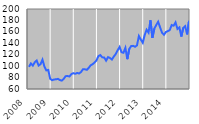
| Category | Series 0 |
|---|---|
| 2008.0 | 98.771 |
| 2.0 | 104.681 |
| 3.0 | 100.936 |
| 4.0 | 106.721 |
| 5.0 | 109.864 |
| 6.0 | 101.053 |
| 7.0 | 103.411 |
| 8.0 | 111.343 |
| 9.0 | 99.469 |
| 10.0 | 92.603 |
| 11.0 | 93.321 |
| 12.0 | 77.827 |
| 2009.0 | 75.386 |
| 2.0 | 76.71 |
| 3.0 | 76.933 |
| 4.0 | 77.768 |
| 5.0 | 75.758 |
| 6.0 | 74.684 |
| 7.0 | 77.626 |
| 8.0 | 82.444 |
| 9.0 | 82.711 |
| 10.0 | 81.892 |
| 11.0 | 86.129 |
| 12.0 | 87.727 |
| 2010.0 | 86.584 |
| 2.0 | 88.111 |
| 3.0 | 87.177 |
| 4.0 | 89.75 |
| 5.0 | 94.631 |
| 6.0 | 94.399 |
| 7.0 | 93.563 |
| 8.0 | 97.037 |
| 9.0 | 101.46 |
| 10.0 | 103.393 |
| 11.0 | 106.37 |
| 12.0 | 110.023 |
| 2011.0 | 117.565 |
| 2.0 | 119.394 |
| 3.0 | 115.41 |
| 4.0 | 115.116 |
| 5.0 | 109.583 |
| 6.0 | 115.85 |
| 7.0 | 114.229 |
| 8.0 | 111.538 |
| 9.0 | 116.877 |
| 10.0 | 121.202 |
| 11.0 | 127.854 |
| 12.0 | 133.608 |
| 2012.0 | 124.327 |
| 2.0 | 123.435 |
| 3.0 | 131.949 |
| 4.0 | 112.153 |
| 5.0 | 130.185 |
| 6.0 | 135.205 |
| 7.0 | 135.497 |
| 8.0 | 133.948 |
| 9.0 | 136.225 |
| 10.0 | 152.669 |
| 11.0 | 146.435 |
| 12.0 | 140.918 |
| 2013.0 | 154.398 |
| 2.0 | 163.794 |
| 3.0 | 158.734 |
| 4.0 | 180.313 |
| 5.0 | 149.486 |
| 6.0 | 165.575 |
| 7.0 | 172.051 |
| 8.0 | 177.712 |
| 9.0 | 167.73 |
| 10.0 | 158.491 |
| 11.0 | 154.886 |
| 12.0 | 159.784 |
| 2014.0 | 161.314 |
| 2.0 | 163.143 |
| 3.0 | 171.935 |
| 4.0 | 170.755 |
| 5.0 | 176.537 |
| 6.0 | 165.013 |
| 7.0 | 167.829 |
| 8.0 | 151.798 |
| 9.0 | 166.942 |
| 10.0 | 169.948 |
| 11.0 | 155.534 |
| 12.0 | 179.171 |